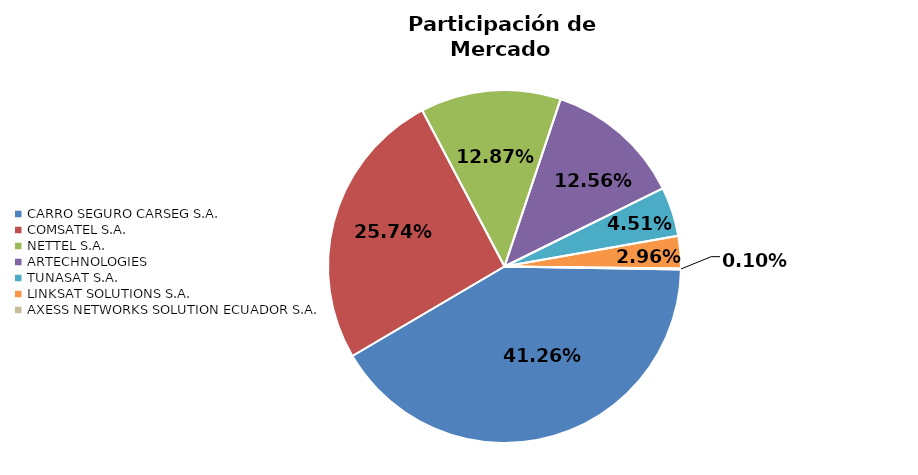
| Category | Series 0 |
|---|---|
| CARRO SEGURO CARSEG S.A. | 0.413 |
| COMSATEL S.A. | 0.257 |
| NETTEL S.A. | 0.129 |
| ARTECHNOLOGIES | 0.126 |
| TUNASAT S.A. | 0.045 |
| LINKSAT SOLUTIONS S.A. | 0.03 |
| AXESS NETWORKS SOLUTION ECUADOR S.A. | 0.001 |